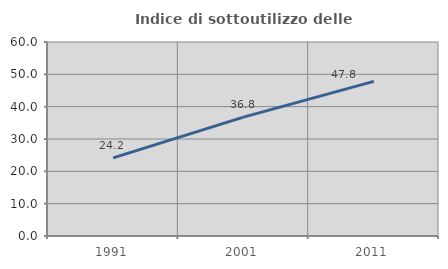
| Category | Indice di sottoutilizzo delle abitazioni  |
|---|---|
| 1991.0 | 24.162 |
| 2001.0 | 36.754 |
| 2011.0 | 47.81 |